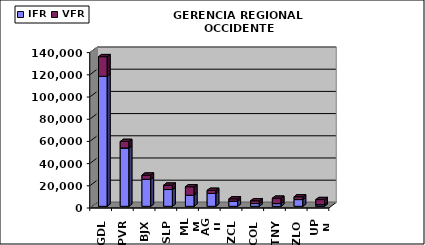
| Category | IFR | VFR |
|---|---|---|
| GDL | 117114 | 17710 |
| PVR | 52579 | 5839 |
| BJX | 24337 | 3763 |
| SLP | 15123 | 3952 |
| MLM | 9927 | 7694 |
| AGU | 11573 | 2798 |
| ZCL | 4669 | 2070 |
| COL | 2480 | 2521 |
| TNY | 2451 | 4831 |
| ZLO | 6094 | 2498 |
| UPN | 1409 | 4647 |